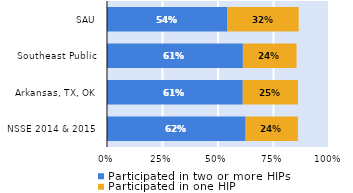
| Category | Participated in two or more HIPs | Participated in one HIP |
|---|---|---|
| NSSE 2014 & 2015 | 0.624 | 0.235 |
| Arkansas, TX, OK | 0.611 | 0.249 |
| Southeast Public | 0.612 | 0.242 |
| SAU | 0.542 | 0.321 |